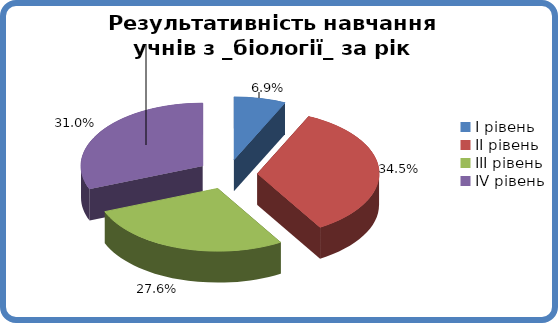
| Category | Series 0 |
|---|---|
| 0 | 0.069 |
| 1 | 0.345 |
| 2 | 0.276 |
| 3 | 0.31 |